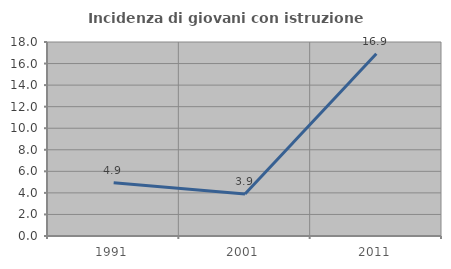
| Category | Incidenza di giovani con istruzione universitaria |
|---|---|
| 1991.0 | 4.938 |
| 2001.0 | 3.9 |
| 2011.0 | 16.905 |